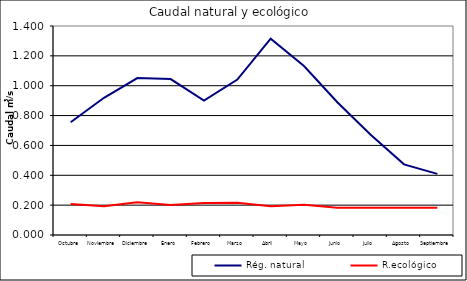
| Category | Rég. natural | R.ecológico |
|---|---|---|
| Octubre | 0.755 | 0.207 |
| Noviembre | 0.919 | 0.193 |
| Diciembre | 1.051 | 0.22 |
| Enero | 1.045 | 0.201 |
| Febrero | 0.901 | 0.214 |
| Marzo | 1.041 | 0.216 |
| Abril | 1.315 | 0.193 |
| Mayo | 1.132 | 0.202 |
| Junio | 0.889 | 0.183 |
| Julio | 0.671 | 0.182 |
| Agosto | 0.473 | 0.182 |
| Septiembre | 0.41 | 0.182 |